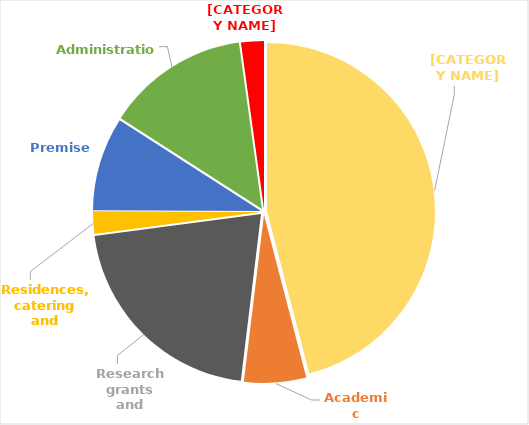
| Category | Series 0 |
|---|---|
| Academic departments | 163741 |
| Academic services | 21277 |
| Research grants and contracts | 74796 |
| Residences, catering and conferences | 7702 |
| Premises | 32168 |
| Administration  | 48851 |
| Other | 7829 |